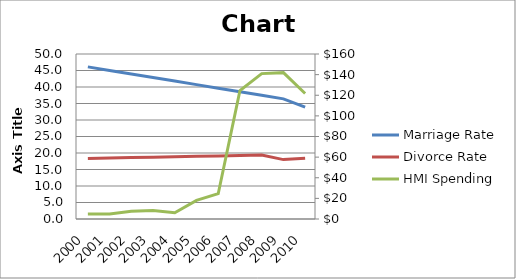
| Category | Marriage Rate | Divorce Rate |
|---|---|---|
| 2000.0 | 46.1 | 18.37 |
| 2001.0 | 45.025 | 18.495 |
| 2002.0 | 43.95 | 18.62 |
| 2003.0 | 42.875 | 18.745 |
| 2004.0 | 41.8 | 18.87 |
| 2005.0 | 40.725 | 18.995 |
| 2006.0 | 39.65 | 19.12 |
| 2007.0 | 38.575 | 19.245 |
| 2008.0 | 37.5 | 19.4 |
| 2009.0 | 36.4 | 18 |
| 2010.0 | 33.9 | 18.4 |